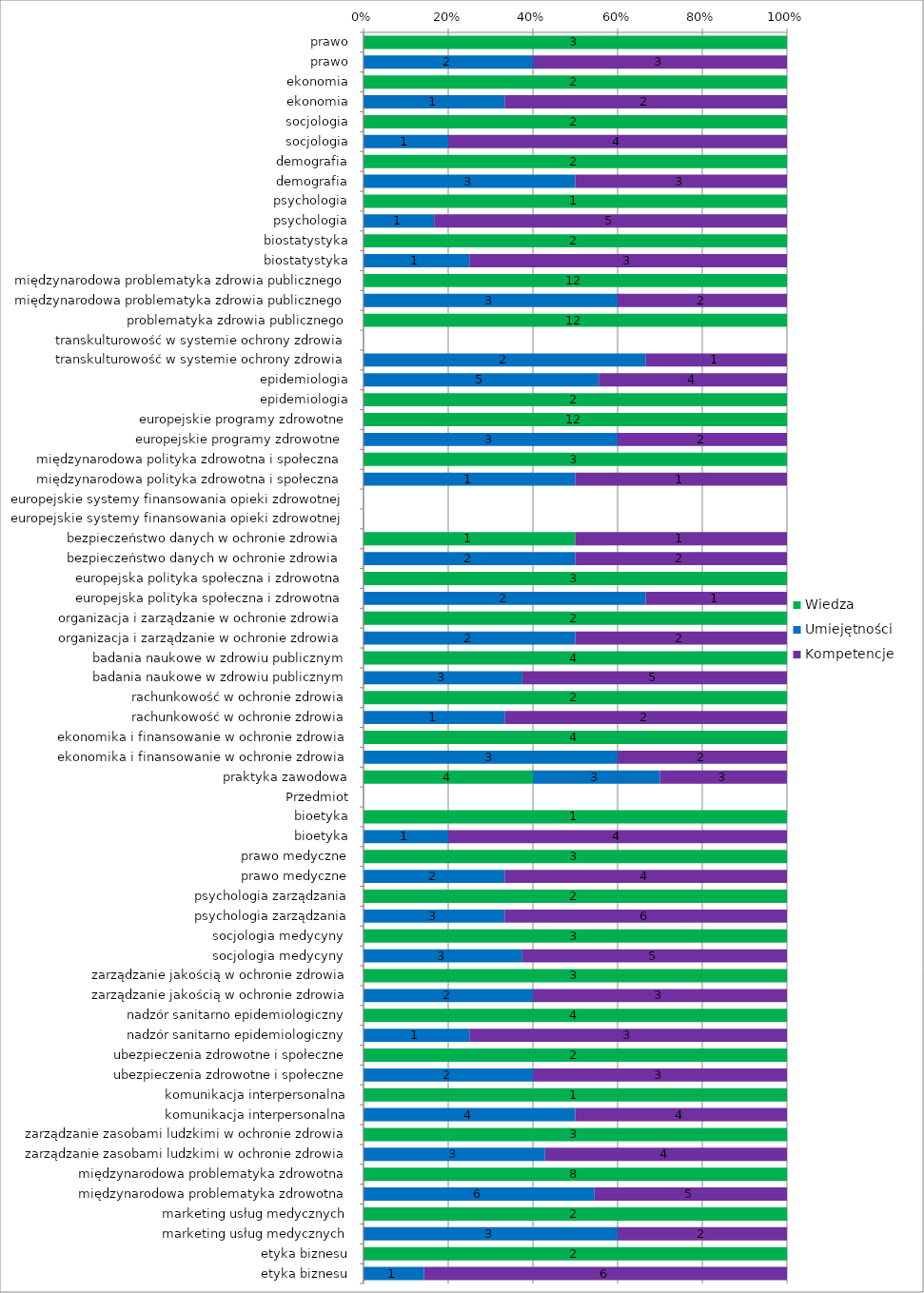
| Category | Wiedza | Umiejętności | Kompetencje |
|---|---|---|---|
|  prawo | 3 | 0 | 0 |
|  prawo | 0 | 2 | 3 |
|  ekonomia | 2 | 0 | 0 |
|  ekonomia | 0 | 1 | 2 |
|  socjologia | 2 | 0 | 0 |
|  socjologia | 0 | 1 | 4 |
|  demografia | 2 | 0 | 0 |
|  demografia | 0 | 3 | 3 |
|  psychologia | 1 | 0 | 0 |
|  psychologia | 0 | 1 | 5 |
|  biostatystyka | 2 | 0 | 0 |
|  biostatystyka | 0 | 1 | 3 |
| międzynarodowa problematyka zdrowia publicznego | 12 | 0 | 0 |
| międzynarodowa problematyka zdrowia publicznego | 0 | 3 | 2 |
|  problematyka zdrowia publicznego | 12 | 0 | 0 |
| transkulturowość w systemie ochrony zdrowia | 0 | 0 | 0 |
| transkulturowość w systemie ochrony zdrowia | 0 | 2 | 1 |
| epidemiologia | 0 | 5 | 4 |
| epidemiologia | 2 | 0 | 0 |
| europejskie programy zdrowotne | 12 | 0 | 0 |
| europejskie programy zdrowotne  | 0 | 3 | 2 |
| międzynarodowa polityka zdrowotna i społeczna  | 3 | 0 | 0 |
| międzynarodowa polityka zdrowotna i społeczna  | 0 | 1 | 1 |
| europejskie systemy finansowania opieki zdrowotnej  | 0 | 0 | 0 |
| europejskie systemy finansowania opieki zdrowotnej  | 0 | 0 | 0 |
| bezpieczeństwo danych w ochronie zdrowia  | 1 | 0 | 1 |
| bezpieczeństwo danych w ochronie zdrowia  | 0 | 2 | 2 |
| europejska polityka społeczna i zdrowotna  | 3 | 0 | 0 |
| europejska polityka społeczna i zdrowotna  | 0 | 2 | 1 |
| organizacja i zarządzanie w ochronie zdrowia  | 2 | 0 | 0 |
| organizacja i zarządzanie w ochronie zdrowia  | 0 | 2 | 2 |
| badania naukowe w zdrowiu publicznym | 4 | 0 | 0 |
| badania naukowe w zdrowiu publicznym | 0 | 3 | 5 |
| rachunkowość w ochronie zdrowia | 2 | 0 | 0 |
| rachunkowość w ochronie zdrowia | 0 | 1 | 2 |
| ekonomika i finansowanie w ochronie zdrowia | 4 | 0 | 0 |
| ekonomika i finansowanie w ochronie zdrowia | 0 | 3 | 2 |
| praktyka zawodowa | 4 | 3 | 3 |
| Przedmiot | 0 | 0 | 0 |
| bioetyka | 1 | 0 | 0 |
| bioetyka | 0 | 1 | 4 |
| prawo medyczne | 3 | 0 | 0 |
| prawo medyczne | 0 | 2 | 4 |
| psychologia zarządzania | 2 | 0 | 0 |
| psychologia zarządzania | 0 | 3 | 6 |
| socjologia medycyny  | 3 | 0 | 0 |
| socjologia medycyny  | 0 | 3 | 5 |
| zarządzanie jakością w ochronie zdrowia | 3 | 0 | 0 |
| zarządzanie jakością w ochronie zdrowia | 0 | 2 | 3 |
| nadzór sanitarno epidemiologiczny | 4 | 0 | 0 |
| nadzór sanitarno epidemiologiczny | 0 | 1 | 3 |
| ubezpieczenia zdrowotne i społeczne | 2 | 0 | 0 |
| ubezpieczenia zdrowotne i społeczne | 0 | 2 | 3 |
| komunikacja interpersonalna | 1 | 0 | 0 |
| komunikacja interpersonalna | 0 | 4 | 4 |
| zarządzanie zasobami ludzkimi w ochronie zdrowia | 3 | 0 | 0 |
| zarządzanie zasobami ludzkimi w ochronie zdrowia | 0 | 3 | 4 |
| międzynarodowa problematyka zdrowotna | 8 | 0 | 0 |
| międzynarodowa problematyka zdrowotna | 0 | 6 | 5 |
| marketing usług medycznych | 2 | 0 | 0 |
| marketing usług medycznych | 0 | 3 | 2 |
| etyka biznesu | 2 | 0 | 0 |
| etyka biznesu | 0 | 1 | 6 |